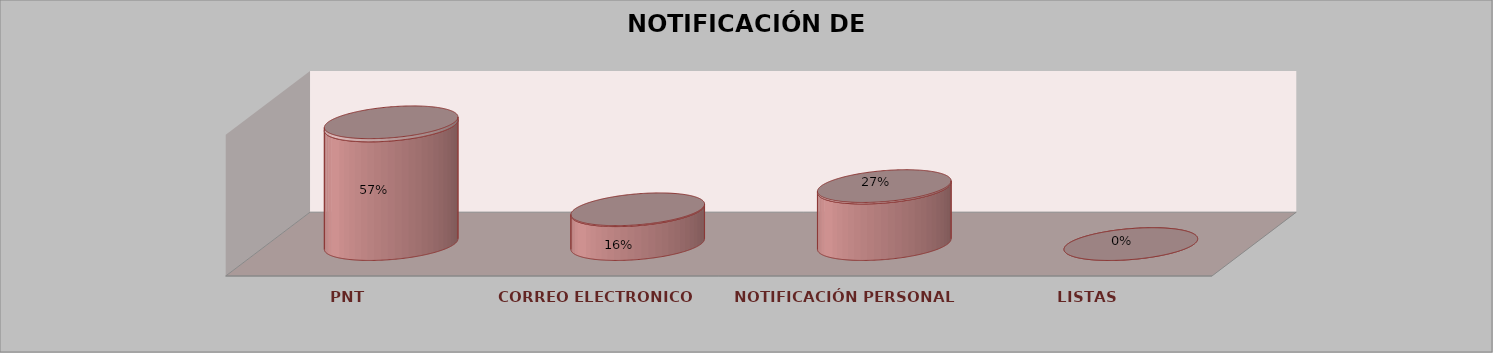
| Category | Series 0 | Series 1 | Series 2 | Series 3 | Series 4 |
|---|---|---|---|---|---|
| PNT |  |  |  | 21 | 0.568 |
| CORREO ELECTRONICO |  |  |  | 6 | 0.162 |
| NOTIFICACIÓN PERSONAL |  |  |  | 10 | 0.27 |
| LISTAS |  |  |  | 0 | 0 |